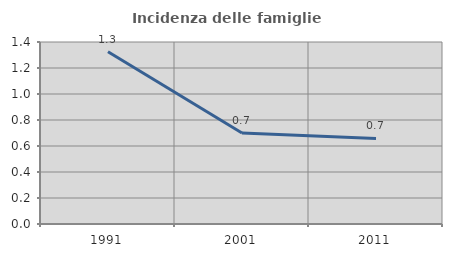
| Category | Incidenza delle famiglie numerose |
|---|---|
| 1991.0 | 1.325 |
| 2001.0 | 0.699 |
| 2011.0 | 0.658 |